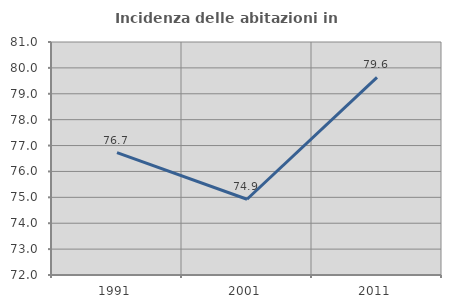
| Category | Incidenza delle abitazioni in proprietà  |
|---|---|
| 1991.0 | 76.726 |
| 2001.0 | 74.926 |
| 2011.0 | 79.634 |